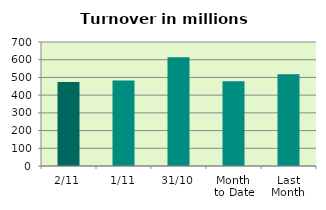
| Category | Series 0 |
|---|---|
| 2/11 | 474.246 |
| 1/11 | 482.039 |
| 31/10 | 614.003 |
| Month 
to Date | 478.142 |
| Last
Month | 517.71 |